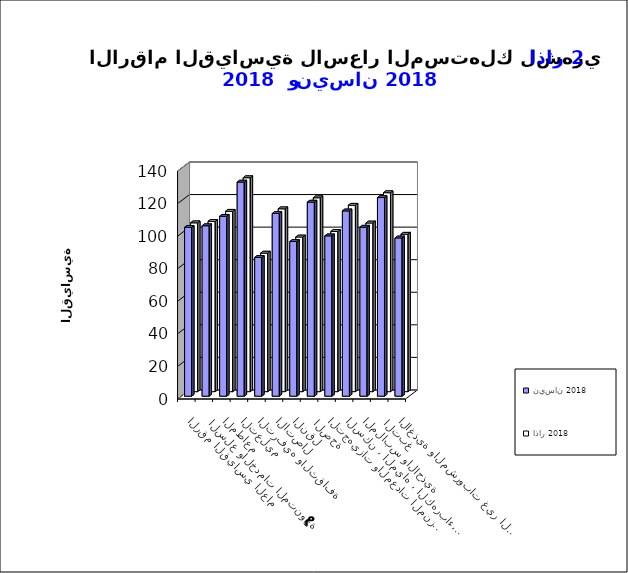
| Category | نيسان 2018      | اذار 2018       |
|---|---|---|
| الاغذية والمشروبات غير الكحولية | 97.2 | 96.7 |
|  التبغ | 122 | 122.2 |
| الملابس والاحذية | 103.8 | 103.6 |
| السكن ، المياه ، الكهرباء، الغاز  | 113.8 | 114.5 |
| التجهيزات والمعدات المنزلية والصيانة | 98.5 | 98.4 |
|  الصحة | 119.2 | 119.1 |
| النقل | 95 | 95 |
| الاتصال | 112.2 | 112.3 |
| الترفيه والثقافة | 85.2 | 85.1 |
| التعليم | 131.5 | 131.4 |
| المطاعم  | 110.5 | 110.8 |
|  السلع والخدمات المتنوعة | 104.7 | 104.6 |
| الرقم القياسي العام | 103.7 | 103.7 |